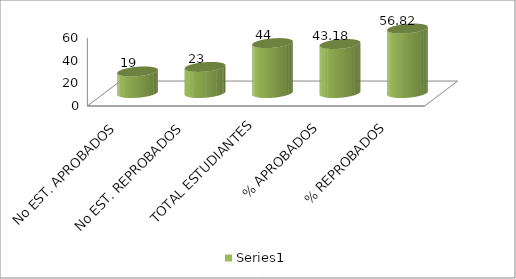
| Category | Series 0 |
|---|---|
| No EST. APROBADOS | 19 |
| No EST. REPROBADOS | 23 |
| TOTAL ESTUDIANTES | 44 |
| % APROBADOS | 43.182 |
| % REPROBADOS | 56.818 |